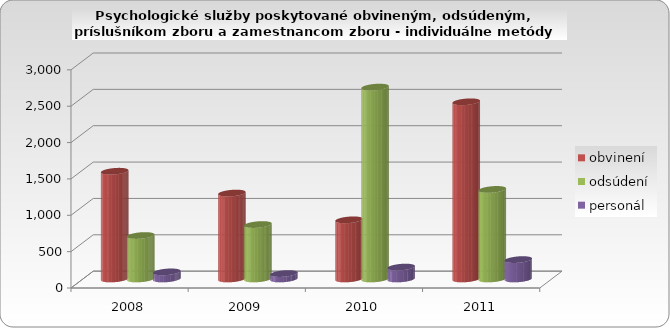
| Category | obvinení | odsúdení | personál |
|---|---|---|---|
| 2008.0 | 1482 | 598 | 98 |
| 2009.0 | 1182 | 749 | 75 |
| 2010.0 | 814 | 2639 | 164 |
| 2011.0 | 2437 | 1232 | 267 |